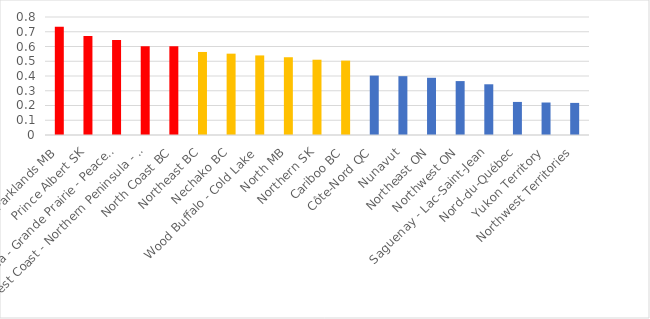
| Category | AVI |
|---|---|
| Parklands MB | 0.733 |
| Prince Albert SK | 0.671 |
| Athabasca - Grande Prairie - Peace River | 0.645 |
| West Coast - Northern Peninsula - Labrador | 0.602 |
| North Coast BC | 0.601 |
| Northeast BC | 0.563 |
| Nechako BC | 0.551 |
| Wood Buffalo - Cold Lake | 0.539 |
| North MB | 0.527 |
| Northern SK | 0.51 |
| Cariboo BC | 0.504 |
| Côte-Nord QC | 0.403 |
| Nunavut | 0.399 |
| Northeast ON | 0.388 |
| Northwest ON | 0.366 |
| Saguenay - Lac-Saint-Jean | 0.344 |
| Nord-du-Québec | 0.224 |
| Yukon Territory | 0.22 |
| Northwest Territories | 0.218 |